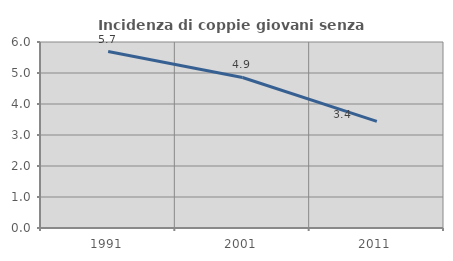
| Category | Incidenza di coppie giovani senza figli |
|---|---|
| 1991.0 | 5.692 |
| 2001.0 | 4.856 |
| 2011.0 | 3.442 |